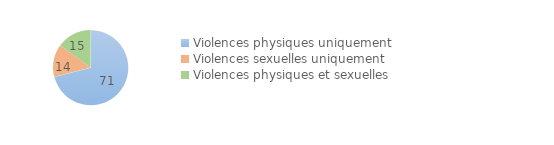
| Category | Series 0 |
|---|---|
| Violences physiques uniquement | 71 |
| Violences sexuelles uniquement | 14 |
| Violences physiques et sexuelles | 15 |